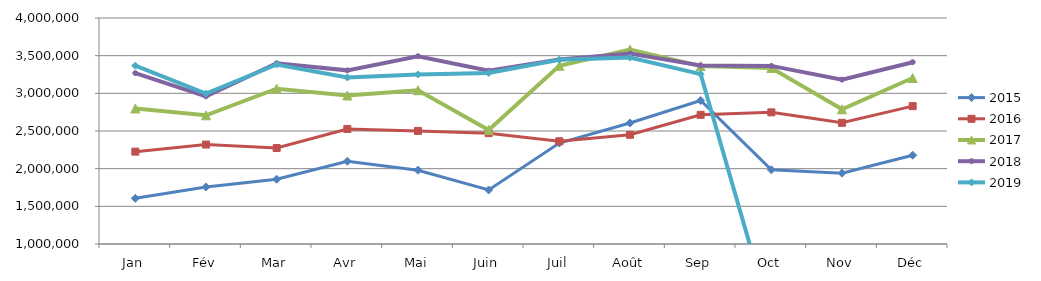
| Category | 2015 | 2016 | 2017 | 2018 | 2019 |
|---|---|---|---|---|---|
| Jan | 1606333.482 | 2226093.309 | 2798915.391 | 3268127.156 | 3367510.542 |
| Fév | 1757411.057 | 2320135.002 | 2708507.11 | 2960518.709 | 2995707.194 |
| Mar | 1860162.235 | 2274111.99 | 3061215.361 | 3399788.443 | 3382590.899 |
| Avr | 2098793.379 | 2526794.87 | 2970911.094 | 3304906.324 | 3209954.832 |
| Mai | 1979551.026 | 2500868.782 | 3040805.262 | 3492911.082 | 3251146.092 |
| Juin | 1717368.136 | 2471115.702 | 2513480.318 | 3300924.802 | 3269085.474 |
| Juil | 2340589.709 | 2363852.978 | 3365511.031 | 3448603.566 | 3445052.713 |
| Août | 2606695.251 | 2449927.953 | 3580436.797 | 3528173.012 | 3474993.525 |
| Sep | 2905220.31 | 2714390.875 | 3361524.335 | 3369626.193 | 3255644.054 |
| Oct | 1984901.649 | 2747632.929 | 3335934.501 | 3364260.879 | 0 |
| Nov | 1940228.65 | 2608583.302 | 2787992.168 | 3181888.576 | 0 |
| Déc | 2178977.981 | 2830164.13 | 3203732.398 | 3413454.996 | 0 |